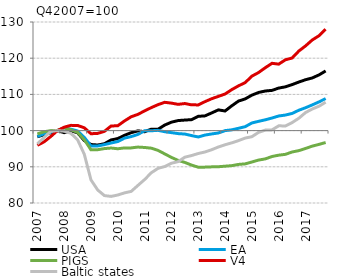
| Category | USA | EA | PIGS | V4 | Baltic states |
|---|---|---|---|---|---|
| 2007.0 | 98.296 | 98.392 | 99.081 | 95.939 | 96.34 |
| nan | 98.859 | 99.083 | 99.678 | 96.895 | 98.081 |
| nan | 99.396 | 99.501 | 99.994 | 98.356 | 99.793 |
| nan | 100 | 100 | 100.063 | 100 | 100 |
| 2008.0 | 99.425 | 100.726 | 100.748 | 100.945 | 99.835 |
| nan | 99.939 | 100.397 | 100.212 | 101.445 | 99.251 |
| nan | 99.398 | 99.886 | 99.505 | 101.428 | 97.468 |
| nan | 97.247 | 98.131 | 97.465 | 100.775 | 93.475 |
| 2009.0 | 96.155 | 95.757 | 94.685 | 99.133 | 86.37 |
| nan | 96.017 | 95.754 | 94.727 | 99.228 | 83.596 |
| nan | 96.366 | 96.134 | 95.033 | 99.785 | 82.048 |
| nan | 97.425 | 96.573 | 95.185 | 101.266 | 81.821 |
| 2010.0 | 97.8 | 96.975 | 94.987 | 101.352 | 82.211 |
| nan | 98.701 | 97.922 | 95.218 | 102.672 | 82.8 |
| nan | 99.429 | 98.345 | 95.224 | 103.827 | 83.21 |
| nan | 99.928 | 98.949 | 95.449 | 104.484 | 84.856 |
| 2011.0 | 99.688 | 99.958 | 95.337 | 105.452 | 86.483 |
| nan | 100.401 | 99.954 | 95.144 | 106.351 | 88.354 |
| nan | 100.373 | 100.069 | 94.536 | 107.169 | 89.576 |
| nan | 101.536 | 99.693 | 93.564 | 107.814 | 90.075 |
| 2012.0 | 102.331 | 99.44 | 92.59 | 107.586 | 90.987 |
| nan | 102.771 | 99.169 | 91.769 | 107.254 | 91.428 |
| nan | 102.91 | 99.05 | 91.205 | 107.475 | 92.654 |
| nan | 103.027 | 98.622 | 90.472 | 107.116 | 93.108 |
| 2013.0 | 103.94 | 98.241 | 89.89 | 107.1 | 93.672 |
| nan | 104.068 | 98.767 | 89.908 | 107.997 | 94.092 |
| nan | 104.883 | 99.073 | 89.983 | 108.806 | 94.716 |
| nan | 105.721 | 99.347 | 90.021 | 109.451 | 95.474 |
| 2014.0 | 105.422 | 99.991 | 90.168 | 110.108 | 96.088 |
| nan | 106.849 | 100.212 | 90.318 | 111.322 | 96.62 |
| nan | 108.153 | 100.637 | 90.658 | 112.359 | 97.236 |
| nan | 108.762 | 101.083 | 90.81 | 113.263 | 97.932 |
| 2015.0 | 109.794 | 102.113 | 91.327 | 115.042 | 98.318 |
| nan | 110.537 | 102.561 | 91.862 | 116.045 | 99.522 |
| nan | 110.938 | 102.982 | 92.183 | 117.374 | 100.136 |
| nan | 111.116 | 103.477 | 92.844 | 118.592 | 100.2 |
| 2016.0 | 111.745 | 104.038 | 93.208 | 118.358 | 101.315 |
| nan | 112.094 | 104.294 | 93.445 | 119.563 | 101.29 |
| nan | 112.704 | 104.743 | 94.094 | 120.049 | 102.213 |
| nan | 113.413 | 105.623 | 94.466 | 121.981 | 103.411 |
| 2017.0 | 114.055 | 106.314 | 95.063 | 123.395 | 104.982 |
| nan | 114.542 | 107.092 | 95.71 | 125.03 | 105.965 |
| nan | 115.377 | 107.922 | 96.186 | 126.197 | 106.726 |
| nan | 116.479 | 108.853 | 96.71 | 128.005 | 107.85 |